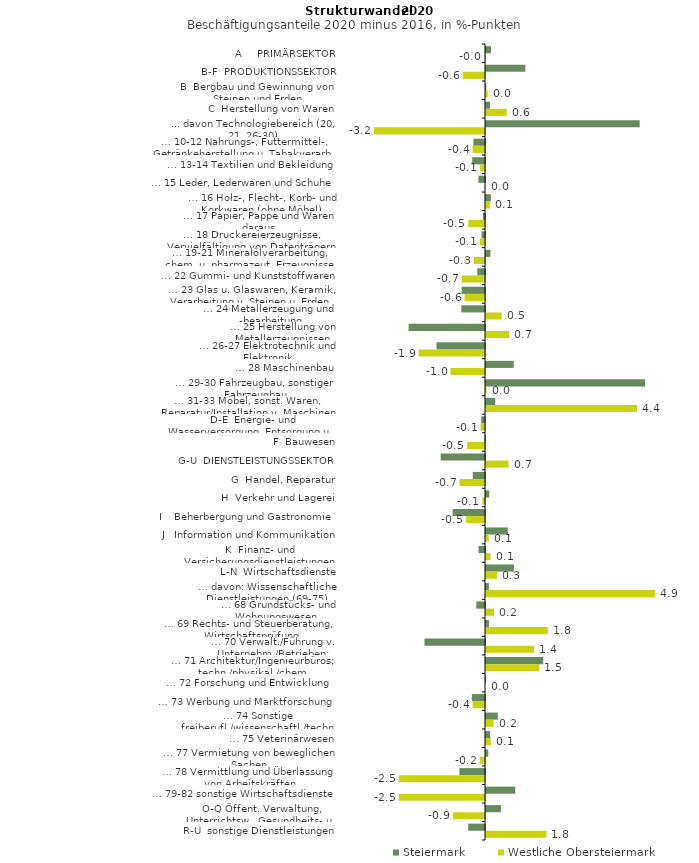
| Category | Steiermark | Westliche Obersteiermark |
|---|---|---|
| A     PRIMÄRSEKTOR | 0.145 | -0.006 |
| B-F  PRODUKTIONSSEKTOR | 1.14 | -0.646 |
| B  Bergbau und Gewinnung von Steinen und Erden | 0.008 | 0.047 |
| C  Herstellung von Waren | 0.118 | 0.601 |
| ... davon Technologiebereich (20, 21, 26-30) | 4.454 | -3.219 |
| … 10-12 Nahrungs-, Futtermittel-, Getränkeherstellung u. Tabakverarb. | -0.336 | -0.358 |
| … 13-14 Textilien und Bekleidung | -0.37 | -0.143 |
| … 15 Leder, Lederwaren und Schuhe | -0.191 | 0 |
| … 16 Holz-, Flecht-, Korb- und Korkwaren (ohne Möbel)  | 0.142 | 0.121 |
| … 17 Papier, Pappe und Waren daraus  | -0.062 | -0.485 |
| … 18 Druckereierzeugnisse, Vervielfältigung von Datenträgern | -0.099 | -0.146 |
| … 19-21 Mineralölverarbeitung, chem. u. pharmazeut. Erzeugnisse | 0.129 | -0.325 |
| … 22 Gummi- und Kunststoffwaren | -0.225 | -0.674 |
| … 23 Glas u. Glaswaren, Keramik, Verarbeitung v. Steinen u. Erden  | -0.677 | -0.592 |
| … 24 Metallerzeugung und -bearbeitung | -0.687 | 0.453 |
| … 25 Herstellung von Metallerzeugnissen  | -2.216 | 0.674 |
| … 26-27 Elektrotechnik und Elektronik | -1.407 | -1.922 |
| … 28 Maschinenbau | 0.802 | -1 |
| … 29-30 Fahrzeugbau, sonstiger Fahrzeugbau | 4.612 | 0.016 |
| … 31-33 Möbel, sonst. Waren, Reparatur/Installation v. Maschinen | 0.268 | 4.381 |
| D-E  Energie- und Wasserversorgung, Entsorgung u. Rückgewinnung | -0.111 | -0.13 |
| F  Bauwesen | -0.015 | -0.519 |
| G-U  DIENSTLEISTUNGSSEKTOR | -1.285 | 0.655 |
| G  Handel, Reparatur | -0.356 | -0.738 |
| H  Verkehr und Lagerei | 0.094 | -0.075 |
| I    Beherbergung und Gastronomie | -0.938 | -0.547 |
| J   Information und Kommunikation | 0.633 | 0.076 |
| K  Finanz- und Versicherungsdienstleistungen | -0.188 | 0.131 |
| L-N  Wirtschaftsdienste | 0.81 | 0.321 |
| … davon: Wissenschaftliche Dienstleistungen (69-75) | 0.083 | 4.908 |
| … 68 Grundstücks- und Wohnungswesen  | -0.253 | 0.235 |
| … 69 Rechts- und Steuerberatung, Wirtschaftsprüfung | 0.086 | 1.792 |
| … 70 Verwalt./Führung v. Unternehm./Betrieben; Unternehmensberat. | -1.753 | 1.396 |
| … 71 Architektur/Ingenieurbüros; techn./physikal./chem. Untersuchung | 1.66 | 1.547 |
| … 72 Forschung und Entwicklung  | 0.004 | 0 |
| … 73 Werbung und Marktforschung | -0.382 | -0.36 |
| … 74 Sonstige freiberufl./wissenschaftl./techn. Tätigkeiten | 0.344 | 0.219 |
| … 75 Veterinärwesen | 0.121 | 0.138 |
| … 77 Vermietung von beweglichen Sachen  | 0.066 | -0.152 |
| … 78 Vermittlung und Überlassung von Arbeitskräften | -0.742 | -2.497 |
| … 79-82 sonstige Wirtschaftsdienste | 0.848 | -2.495 |
| O-Q Öffent. Verwaltung, Unterrichtsw., Gesundheits- u. Sozialwesen | 0.432 | -0.933 |
| R-U  sonstige Dienstleistungen | -0.488 | 1.753 |